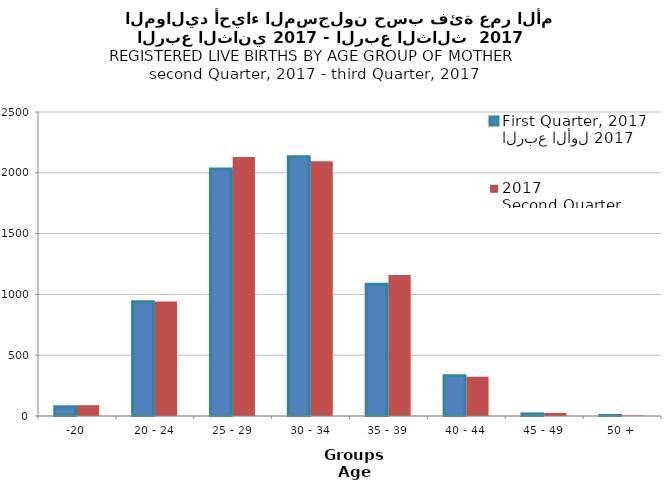
| Category | الربع الأول 2017
First Quarter, 2017 | الربع الثاني 2017
Second Quarter, 2017 |
|---|---|---|
| -20 | 76 | 89 |
| 20 - 24 | 940 | 942 |
| 25 - 29 | 2031 | 2129 |
| 30 - 34 | 2132 | 2094 |
| 35 - 39 | 1084 | 1160 |
| 40 - 44 | 332 | 323 |
| 45 - 49 | 17 | 25 |
| 50 + | 4 | 4 |